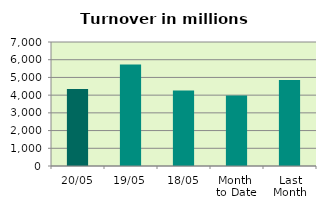
| Category | Series 0 |
|---|---|
| 20/05 | 4344.389 |
| 19/05 | 5730.879 |
| 18/05 | 4259.323 |
| Month 
to Date | 3984.767 |
| Last
Month | 4850.364 |